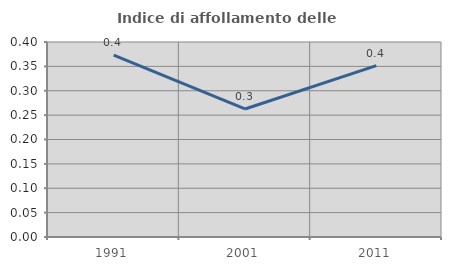
| Category | Indice di affollamento delle abitazioni  |
|---|---|
| 1991.0 | 0.373 |
| 2001.0 | 0.263 |
| 2011.0 | 0.351 |